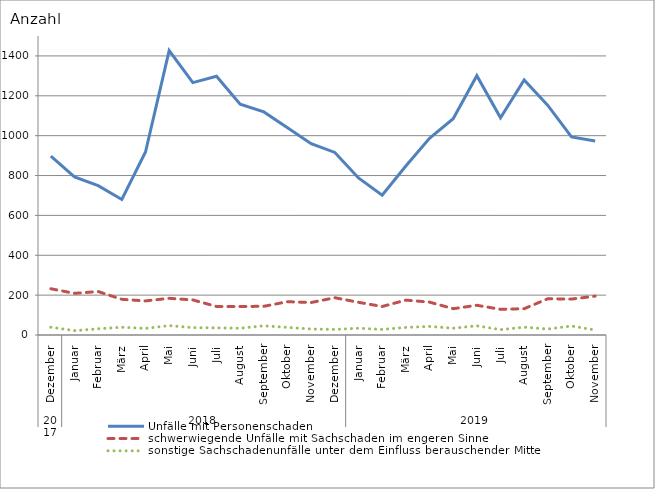
| Category | Unfälle mit Personenschaden | schwerwiegende Unfälle mit Sachschaden im engeren Sinne | sonstige Sachschadenunfälle unter dem Einfluss berauschender Mittel |
|---|---|---|---|
| 0 | 897 | 232 | 39 |
| 1 | 793 | 209 | 22 |
| 2 | 749 | 218 | 31 |
| 3 | 680 | 179 | 39 |
| 4 | 918 | 171 | 33 |
| 5 | 1427 | 184 | 47 |
| 6 | 1266 | 176 | 37 |
| 7 | 1298 | 143 | 36 |
| 8 | 1158 | 143 | 34 |
| 9 | 1119 | 144 | 46 |
| 10 | 1040 | 167 | 38 |
| 11 | 960 | 163 | 30 |
| 12 | 916 | 187 | 28 |
| 13 | 788 | 164 | 34 |
| 14 | 701 | 143 | 28 |
| 15 | 848 | 175 | 38 |
| 16 | 987 | 165 | 43 |
| 17 | 1085 | 132 | 34 |
| 18 | 1301 | 149 | 46 |
| 19 | 1090 | 129 | 27 |
| 20 | 1279 | 132 | 39 |
| 21 | 1152 | 182 | 30 |
| 22 | 994 | 180 | 45 |
| 23 | 973 | 195 | 25 |